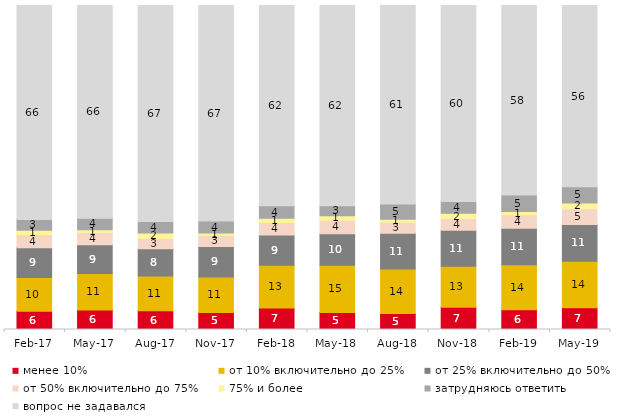
| Category | менее 10% | от 10% включительно до 25% | от 25% включительно до 50% | от 50% включительно до 75% | 75% и более | затрудняюсь ответить | вопрос не задавался |
|---|---|---|---|---|---|---|---|
| 2017-02-01 | 5.65 | 10.4 | 9.15 | 4.1 | 1.3 | 3.35 | 66.05 |
| 2017-05-01 | 6 | 11.3 | 8.85 | 3.75 | 0.9 | 3.55 | 65.65 |
| 2017-08-01 | 5.8 | 10.75 | 8.4 | 3.15 | 1.65 | 3.55 | 66.7 |
| 2017-11-01 | 5.25 | 10.95 | 9.4 | 3.45 | 0.7 | 3.75 | 66.5 |
| 2018-02-01 | 6.6 | 13.25 | 9.35 | 3.85 | 1.25 | 3.9 | 61.8 |
| 2018-05-01 | 5.25 | 14.6 | 9.7 | 4.2 | 1.35 | 3.1 | 61.8 |
| 2018-08-01 | 4.9 | 13.75 | 11.05 | 3.4 | 0.9 | 4.7 | 61.3 |
| 2018-11-01 | 6.886 | 12.625 | 11.128 | 3.543 | 1.697 | 3.643 | 60.479 |
| 2019-02-01 | 6.1 | 13.85 | 11.3 | 4.2 | 0.95 | 5.15 | 58.45 |
| 2019-05-01 | 6.686 | 14.364 | 11.392 | 4.854 | 1.734 | 5.002 | 55.968 |